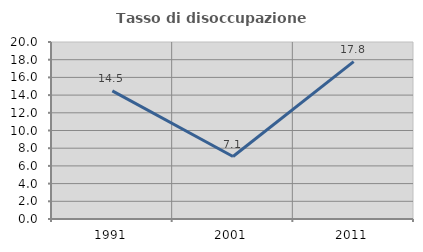
| Category | Tasso di disoccupazione giovanile  |
|---|---|
| 1991.0 | 14.474 |
| 2001.0 | 7.059 |
| 2011.0 | 17.778 |